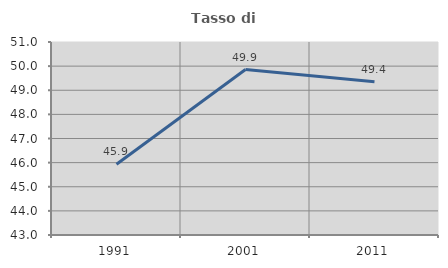
| Category | Tasso di occupazione   |
|---|---|
| 1991.0 | 45.935 |
| 2001.0 | 49.857 |
| 2011.0 | 49.352 |